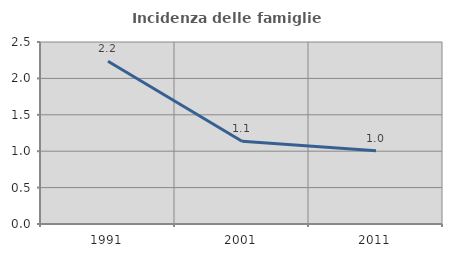
| Category | Incidenza delle famiglie numerose |
|---|---|
| 1991.0 | 2.237 |
| 2001.0 | 1.137 |
| 2011.0 | 1.006 |